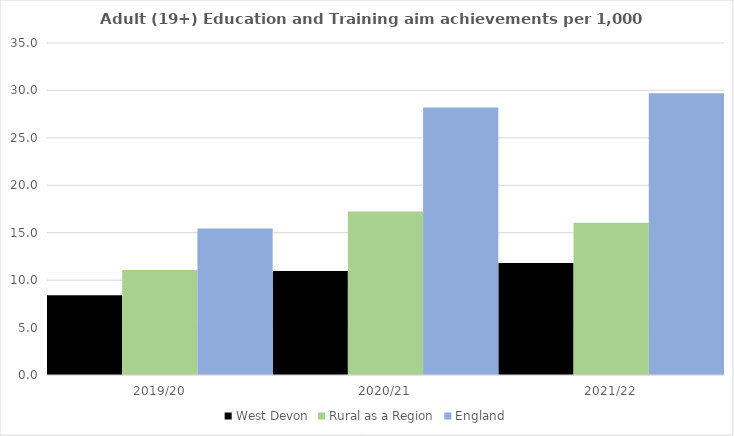
| Category | West Devon | Rural as a Region | England |
|---|---|---|---|
| 2019/20 | 8.398 | 11.081 | 15.446 |
| 2020/21 | 10.958 | 17.224 | 28.211 |
| 2021/22 | 11.818 | 16.063 | 29.711 |